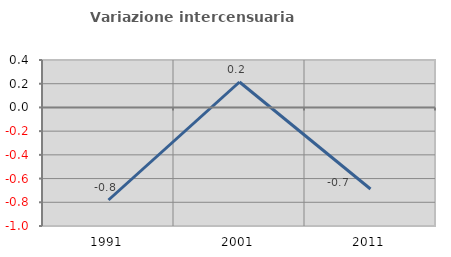
| Category | Variazione intercensuaria annua |
|---|---|
| 1991.0 | -0.781 |
| 2001.0 | 0.214 |
| 2011.0 | -0.688 |